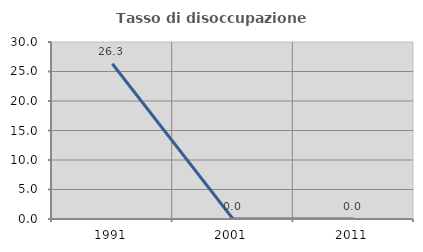
| Category | Tasso di disoccupazione giovanile  |
|---|---|
| 1991.0 | 26.316 |
| 2001.0 | 0 |
| 2011.0 | 0 |